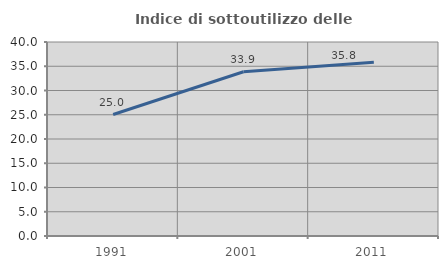
| Category | Indice di sottoutilizzo delle abitazioni  |
|---|---|
| 1991.0 | 25.048 |
| 2001.0 | 33.861 |
| 2011.0 | 35.801 |